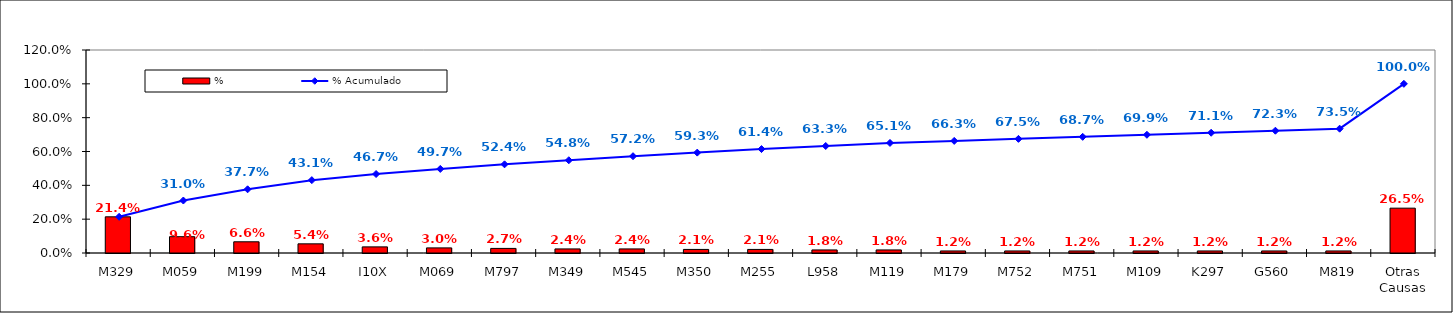
| Category | % |
|---|---|
| M329 | 0.214 |
| M059 | 0.096 |
| M199 | 0.066 |
| M154 | 0.054 |
| I10X | 0.036 |
| M069 | 0.03 |
| M797 | 0.027 |
| M349 | 0.024 |
| M545 | 0.024 |
| M350 | 0.021 |
| M255 | 0.021 |
| L958 | 0.018 |
| M119 | 0.018 |
| M179 | 0.012 |
| M752 | 0.012 |
| M751 | 0.012 |
| M109 | 0.012 |
| K297 | 0.012 |
| G560 | 0.012 |
| M819 | 0.012 |
| Otras Causas | 0.265 |